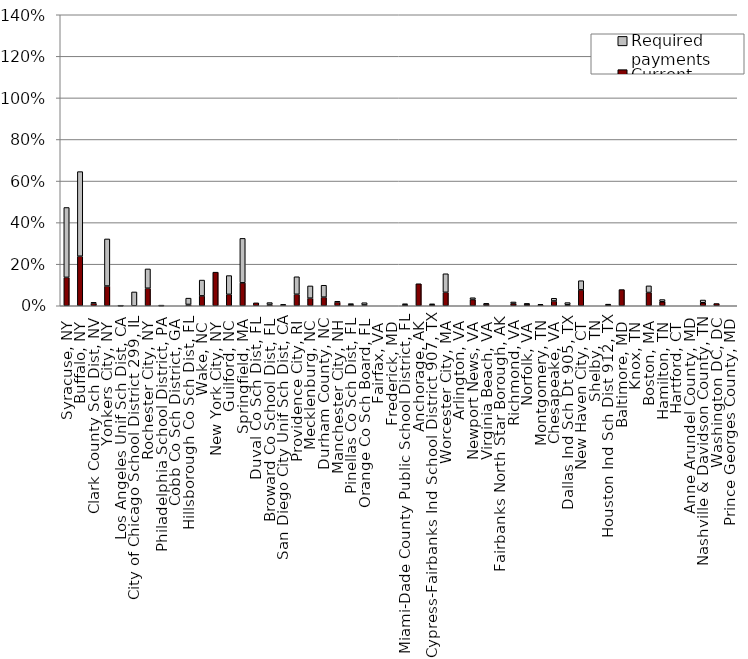
| Category | Current payments | Required payments |
|---|---|---|
| Syracuse, NY | 0.137 | 0.336 |
| Buffalo, NY | 0.238 | 0.407 |
| Clark County Sch Dist, NV | 0.013 | 0.004 |
| Yonkers City, NY | 0.095 | 0.227 |
| Los Angeles Unif Sch Dist, CA | 0 | 0 |
| City of Chicago School District 299, IL | 0 | 0.066 |
| Rochester City, NY | 0.084 | 0.093 |
| Philadelphia School District, PA | 0.001 | 0.001 |
| Cobb Co Sch District, GA | 0 | 0 |
| Hillsborough Co Sch Dist, FL | 0.006 | 0.03 |
| Wake, NC | 0.048 | 0.076 |
| New York City, NY | 0.162 | 0 |
| Guilford, NC | 0.055 | 0.09 |
| Springfield, MA | 0.11 | 0.214 |
| Duval Co Sch Dist, FL | 0.014 | 0 |
| Broward Co School Dist, FL | 0.006 | 0.009 |
| San Diego City Unif Sch Dist, CA | 0.004 | 0.002 |
| Providence City, RI | 0.055 | 0.084 |
| Mecklenburg, NC | 0.037 | 0.059 |
| Durham County, NC | 0.041 | 0.057 |
| Manchester City, NH | 0.018 | 0.004 |
| Pinellas Co Sch Dist, FL | 0.005 | 0.005 |
| Orange Co Sch Board, FL | 0.004 | 0.011 |
| Fairfax, VA | 0 | 0 |
| Frederick, MD | 0 | 0 |
| Miami-Dade County Public School District, FL | 0.006 | 0.004 |
| Anchorage, AK | 0.106 | 0 |
| Cypress-Fairbanks Ind School District 907, TX | 0.006 | 0.002 |
| Worcester City, MA | 0.065 | 0.089 |
| Arlington, VA | 0 | 0 |
| Newport News, VA | 0.03 | 0.009 |
| Virginia Beach, VA | 0.009 | 0.001 |
| Fairbanks North Star Borough, AK | 0 | 0 |
| Richmond, VA | 0.011 | 0.008 |
| Norfolk, VA | 0.009 | 0.001 |
| Montgomery, TN | 0.004 | 0.003 |
| Chesapeake, VA | 0.023 | 0.013 |
| Dallas Ind Sch Dt 905, TX | 0.005 | 0.01 |
| New Haven City, CT | 0.076 | 0.044 |
| Shelby, TN | 0 | 0 |
| Houston Ind Sch Dist 912, TX | 0.005 | 0.002 |
| Baltimore, MD | 0.078 | 0 |
| Knox, TN | 0 | 0 |
| Boston, MA | 0.064 | 0.032 |
| Hamilton, TN | 0.019 | 0.011 |
| Hartford, CT | 0 | 0 |
| Anne Arundel County, MD | 0 | 0 |
| Nashville & Davidson County, TN | 0.014 | 0.013 |
| Washington DC, DC | 0.011 | 0 |
| Prince Georges County, MD | 0 | 0 |